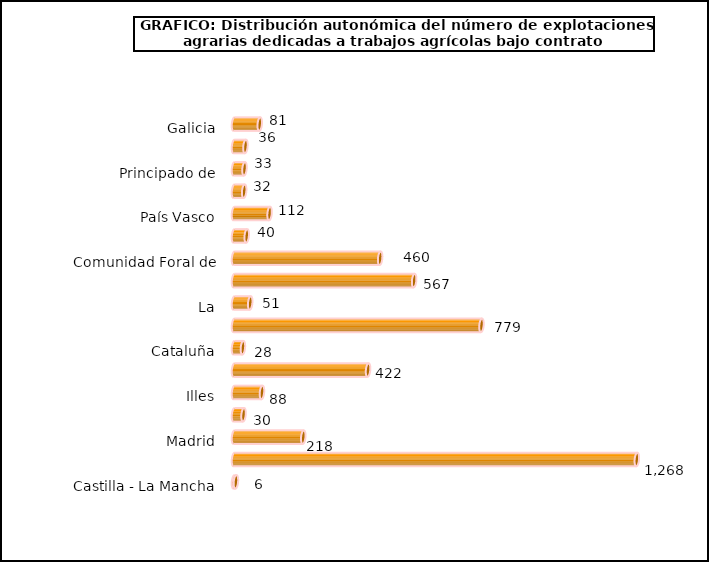
| Category | num. Explotaciones |
|---|---|
| 0 | 81 |
| 1 | 36 |
| 2 | 33 |
| 3 | 32 |
| 4 | 112 |
| 5 | 40 |
| 6 | 460 |
| 7 | 567 |
| 8 | 51 |
| 9 | 779 |
| 10 | 28 |
| 11 | 422 |
| 12 | 88 |
| 13 | 30 |
| 14 | 218 |
| 15 | 1268 |
| 16 | 6 |